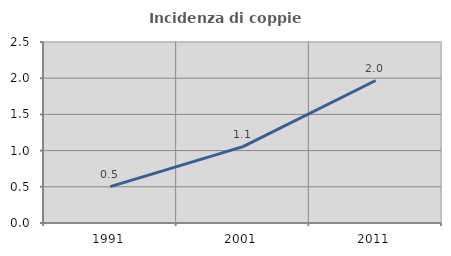
| Category | Incidenza di coppie miste |
|---|---|
| 1991.0 | 0.502 |
| 2001.0 | 1.055 |
| 2011.0 | 1.968 |